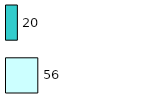
| Category | Series 0 | Series 1 |
|---|---|---|
| 0 | 56 | 20 |